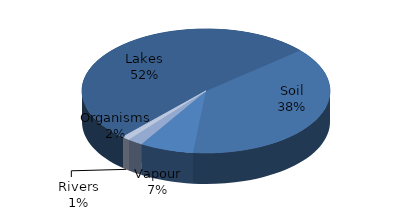
| Category | Series 0 |
|---|---|
| Lakes | 52 |
| Soil | 38 |
| Vapour | 7 |
| Organisms | 2 |
| Rivers | 1 |